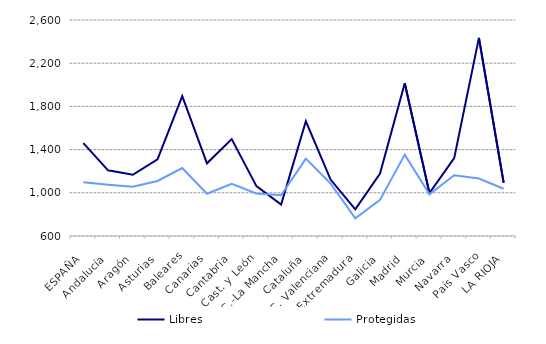
| Category | Libres | Protegidas |
|---|---|---|
| ESPAÑA | 1459.4 | 1098.525 |
| Andalucía | 1208.075 | 1074.475 |
| Aragón | 1167.025 | 1056.8 |
| Asturias | 1309.925 | 1109.225 |
| Baleares | 1895.85 | 1229.175 |
| Canarias | 1272.85 | 991.325 |
| Cantabria | 1496.725 | 1082.967 |
| Cast. y León | 1062.1 | 993.975 |
| C.-La Mancha | 890.475 | 977.9 |
| Cataluña | 1662.6 | 1316.125 |
| C. Valenciana | 1122.25 | 1085.875 |
| Extremadura | 847.45 | 764.55 |
| Galicia | 1178.75 | 934.65 |
| Madrid | 2014.575 | 1353.575 |
| Murcia | 996.6 | 985.475 |
| Navarra | 1320.675 | 1162.575 |
| País Vasco | 2434.775 | 1131.55 |
| LA RIOJA | 1093.225 | 1037.15 |